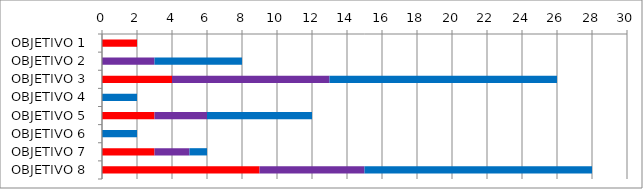
| Category | Series 0 | Series 3 | Series 1 |
|---|---|---|---|
| OBJETIVO 1 | 2 | 0 | 0 |
| OBJETIVO 2 | 0 | 3 | 5 |
| OBJETIVO 3 | 4 | 9 | 13 |
| OBJETIVO 4 | 0 | 0 | 2 |
| OBJETIVO 5 | 3 | 3 | 6 |
| OBJETIVO 6 | 0 | 0 | 2 |
| OBJETIVO 7 | 3 | 2 | 1 |
| OBJETIVO 8 | 9 | 6 | 13 |